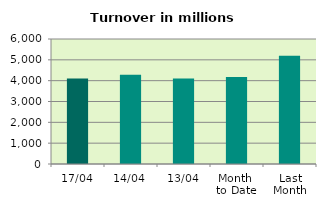
| Category | Series 0 |
|---|---|
| 17/04 | 4108.07 |
| 14/04 | 4279.102 |
| 13/04 | 4104.813 |
| Month 
to Date | 4178.082 |
| Last
Month | 5192.573 |